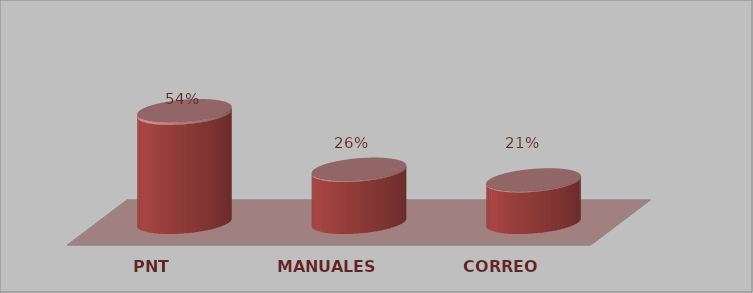
| Category | Series 0 | Series 1 |
|---|---|---|
| PNT | 21 | 0.538 |
| MANUALES | 10 | 0.256 |
| CORREO | 8 | 0.205 |